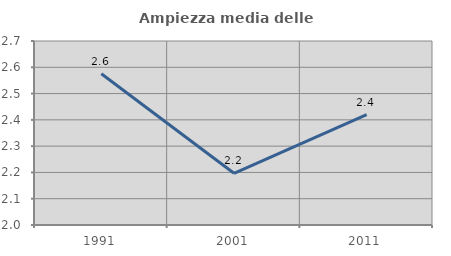
| Category | Ampiezza media delle famiglie |
|---|---|
| 1991.0 | 2.575 |
| 2001.0 | 2.197 |
| 2011.0 | 2.42 |